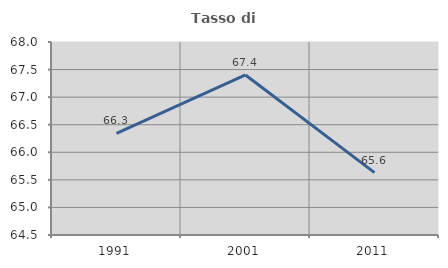
| Category | Tasso di occupazione   |
|---|---|
| 1991.0 | 66.343 |
| 2001.0 | 67.402 |
| 2011.0 | 65.631 |